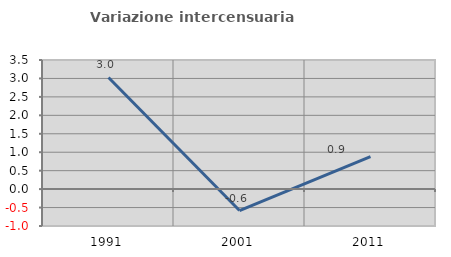
| Category | Variazione intercensuaria annua |
|---|---|
| 1991.0 | 3.027 |
| 2001.0 | -0.581 |
| 2011.0 | 0.881 |